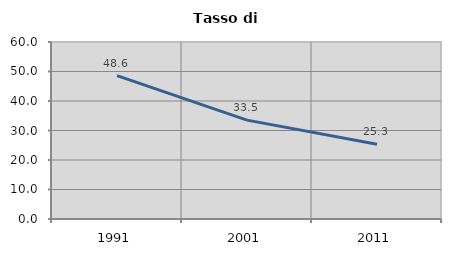
| Category | Tasso di disoccupazione   |
|---|---|
| 1991.0 | 48.625 |
| 2001.0 | 33.516 |
| 2011.0 | 25.342 |